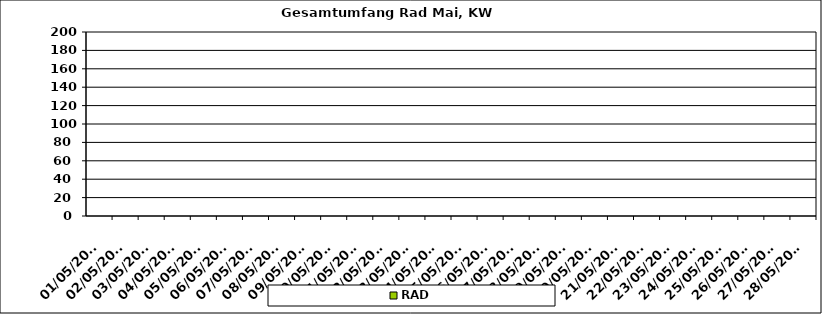
| Category | RAD |
|---|---|
| 01/05/2023 | 0 |
| 02/05/2023 | 0 |
| 03/05/2023 | 0 |
| 04/05/2023 | 0 |
| 05/05/2023 | 0 |
| 06/05/2023 | 0 |
| 07/05/2023 | 0 |
| 08/05/2023 | 0 |
| 09/05/2023 | 0 |
| 10/05/2023 | 0 |
| 11/05/2023 | 0 |
| 12/05/2023 | 0 |
| 13/05/2023 | 0 |
| 14/05/2023 | 0 |
| 15/05/2023 | 0 |
| 16/05/2023 | 0 |
| 17/05/2023 | 0 |
| 18/05/2023 | 0 |
| 19/05/2023 | 0 |
| 20/05/2023 | 0 |
| 21/05/2023 | 0 |
| 22/05/2023 | 0 |
| 23/05/2023 | 0 |
| 24/05/2023 | 0 |
| 25/05/2023 | 0 |
| 26/05/2023 | 0 |
| 27/05/2023 | 0 |
| 28/05/2023 | 0 |